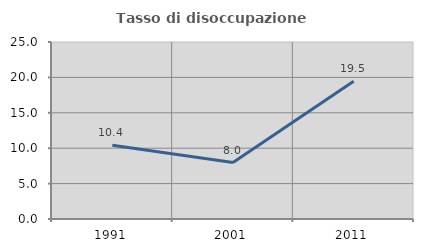
| Category | Tasso di disoccupazione giovanile  |
|---|---|
| 1991.0 | 10.424 |
| 2001.0 | 7.974 |
| 2011.0 | 19.469 |